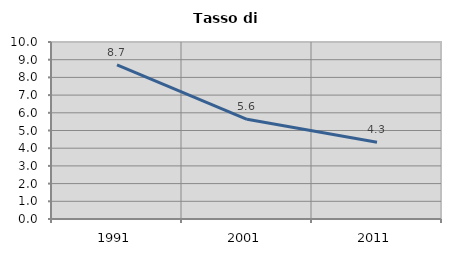
| Category | Tasso di disoccupazione   |
|---|---|
| 1991.0 | 8.703 |
| 2001.0 | 5.63 |
| 2011.0 | 4.34 |